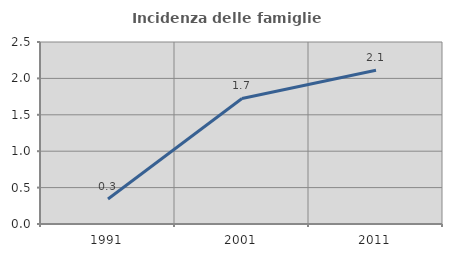
| Category | Incidenza delle famiglie numerose |
|---|---|
| 1991.0 | 0.342 |
| 2001.0 | 1.724 |
| 2011.0 | 2.113 |